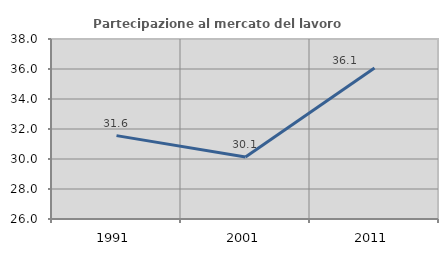
| Category | Partecipazione al mercato del lavoro  femminile |
|---|---|
| 1991.0 | 31.558 |
| 2001.0 | 30.138 |
| 2011.0 | 36.072 |